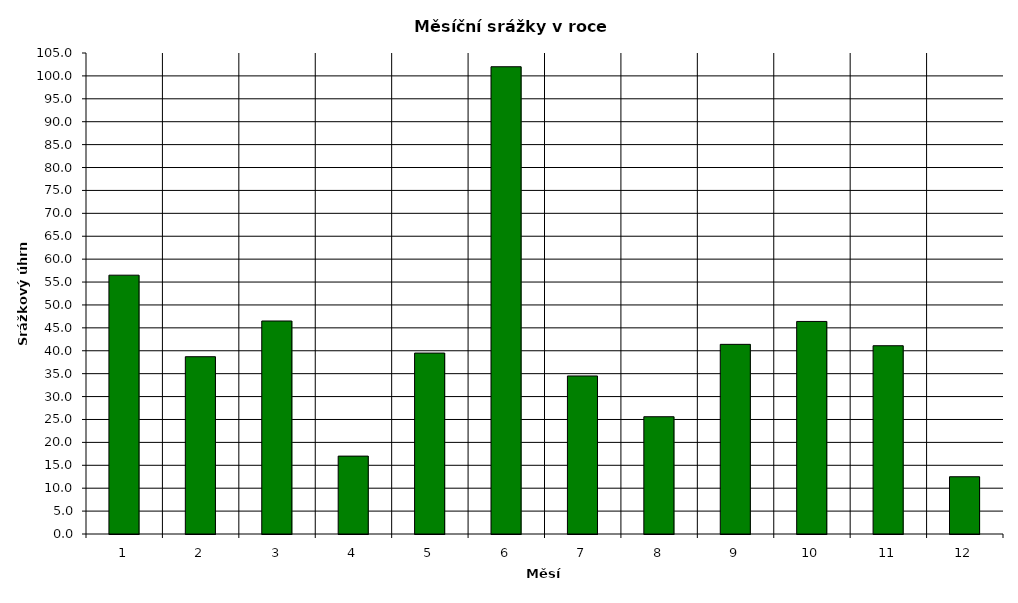
| Category | Series 0 |
|---|---|
| 0 | 56.5 |
| 1 | 38.7 |
| 2 | 46.5 |
| 3 | 17 |
| 4 | 39.5 |
| 5 | 102 |
| 6 | 34.5 |
| 7 | 25.6 |
| 8 | 41.4 |
| 9 | 46.4 |
| 10 | 41.1 |
| 11 | 12.5 |